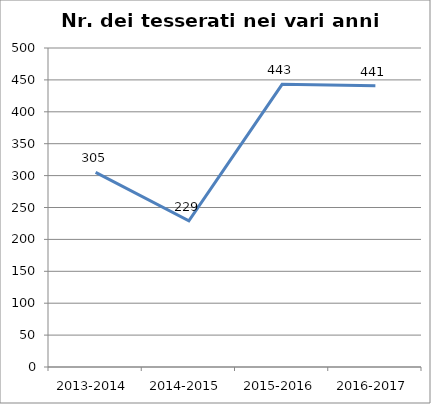
| Category | Nr. Tesserati |
|---|---|
| 2013-2014 | 305 |
| 2014-2015 | 229 |
| 2015-2016 | 443 |
| 2016-2017 | 441 |